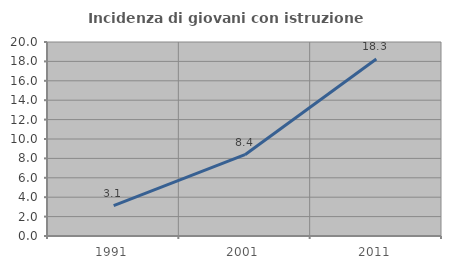
| Category | Incidenza di giovani con istruzione universitaria |
|---|---|
| 1991.0 | 3.14 |
| 2001.0 | 8.381 |
| 2011.0 | 18.256 |